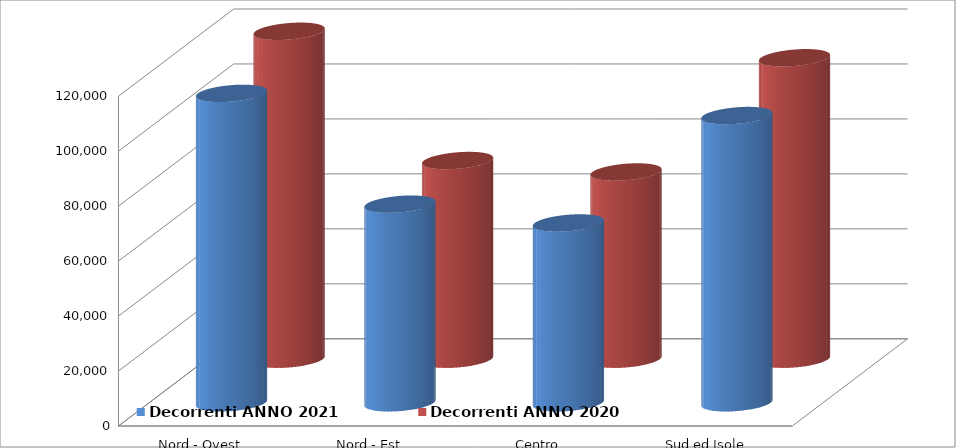
| Category | Decorrenti ANNO 2021 | Decorrenti ANNO 2020 |
|---|---|---|
| Nord - Ovest | 112589 | 119319 |
| Nord - Est | 72281 | 72286 |
| Centro | 65432 | 68118 |
| Sud ed Isole | 104514 | 109678 |